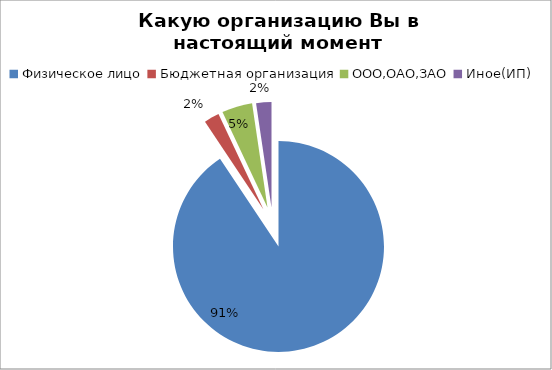
| Category | Какую организацию Вы в настоящий момент представляете? |
|---|---|
| Физическое лицо | 155 |
| Бюджетная организация | 4 |
| ООО,ОАО,ЗАО | 8 |
| Иное(ИП) | 4 |